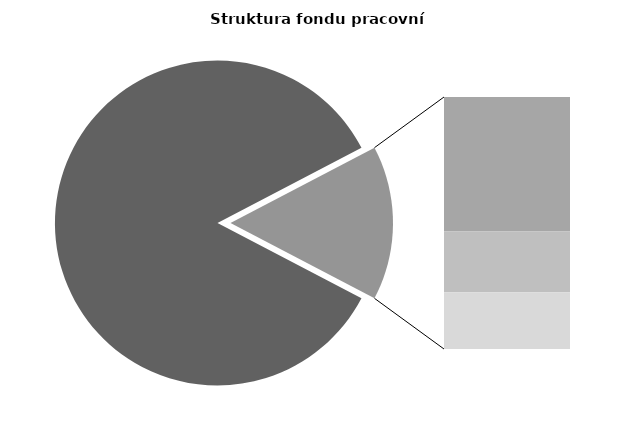
| Category | Series 0 |
|---|---|
| Průměrná měsíční odpracovaná doba bez přesčasu | 143.432 |
| Dovolená | 13.884 |
| Nemoc | 6.27 |
| Jiné | 5.846 |